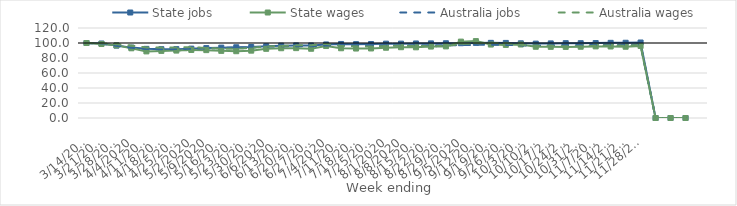
| Category | State jobs | State wages | Australia jobs | Australia wages |
|---|---|---|---|---|
| 14/03/2020 | 100 | 100 | 100 | 100 |
| 21/03/2020 | 99.328 | 98.642 | 99.244 | 99.654 |
| 28/03/2020 | 96.526 | 96.828 | 96.24 | 98.376 |
| 04/04/2020 | 93.842 | 92.925 | 93.611 | 96.647 |
| 11/04/2020 | 92.177 | 88.796 | 91.951 | 94.065 |
| 18/04/2020 | 91.79 | 89.487 | 91.54 | 93.96 |
| 25/04/2020 | 91.814 | 89.881 | 91.89 | 94.086 |
| 02/05/2020 | 92.464 | 90.736 | 92.294 | 94.563 |
| 09/05/2020 | 93.193 | 90.483 | 92.851 | 93.362 |
| 16/05/2020 | 93.824 | 89.513 | 93.38 | 92.559 |
| 23/05/2020 | 94.302 | 89.046 | 93.691 | 92.191 |
| 30/05/2020 | 94.662 | 89.798 | 94.189 | 93.489 |
| 06/06/2020 | 95.668 | 92.248 | 95.112 | 95.384 |
| 13/06/2020 | 96.47 | 93.006 | 95.61 | 96.041 |
| 20/06/2020 | 96.811 | 93.161 | 95.758 | 96.951 |
| 27/06/2020 | 96.714 | 92.313 | 95.662 | 97.048 |
| 04/07/2020 | 98.078 | 95.97 | 96.562 | 98.782 |
| 11/07/2020 | 98.716 | 92.98 | 97.02 | 95.951 |
| 18/07/2020 | 98.456 | 92.618 | 96.939 | 95.522 |
| 25/07/2020 | 98.649 | 92.717 | 97.042 | 95.21 |
| 01/08/2020 | 99.134 | 93.686 | 97.145 | 95.98 |
| 08/08/2020 | 99.158 | 94.385 | 97.028 | 96.418 |
| 15/08/2020 | 99.386 | 94.248 | 96.891 | 95.936 |
| 22/08/2020 | 99.492 | 95.248 | 96.912 | 95.768 |
| 29/08/2020 | 99.674 | 95.464 | 96.951 | 95.924 |
| 05/09/2020 | 99.724 | 101.837 | 97.102 | 98.618 |
| 12/09/2020 | 100.137 | 102.524 | 97.5 | 99.542 |
| 19/09/2020 | 100.19 | 97.919 | 97.636 | 100.304 |
| 26/09/2020 | 100.111 | 97.443 | 97.498 | 99.685 |
| 03/10/2020 | 99.57 | 97.994 | 96.847 | 97.575 |
| 10/10/2020 | 99.171 | 94.999 | 96.677 | 95.876 |
| 17/10/2020 | 99.464 | 94.894 | 97.124 | 96.224 |
| 24/10/2020 | 99.781 | 94.808 | 97.241 | 95.599 |
| 31/10/2020 | 99.737 | 95.006 | 97.306 | 95.715 |
| 07/11/2020 | 99.918 | 95.464 | 97.335 | 96.299 |
| 14/11/2020 | 100.224 | 95.322 | 97.6 | 96.705 |
| 21/11/2020 | 100.322 | 95.002 | 97.567 | 96.396 |
| 28/11/2020 | 100.664 | 96.052 | 97.955 | 97.416 |